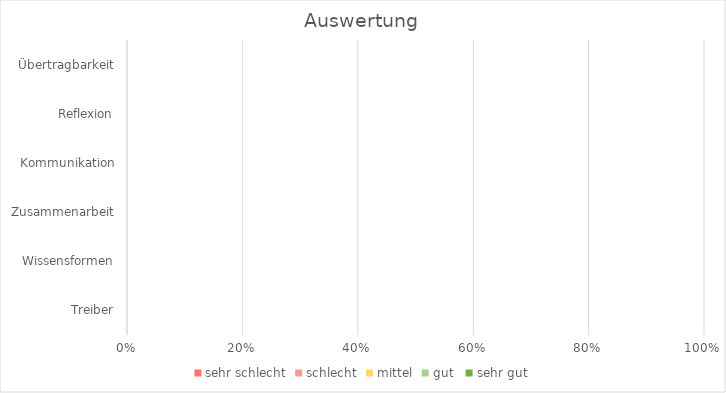
| Category | sehr schlecht | schlecht | mittel | gut  | sehr gut |
|---|---|---|---|---|---|
| Treiber | 0 | 0 | 0 | 0 | 0 |
| Wissensformen | 0 | 0 | 0 | 0 | 0 |
| Zusammenarbeit | 0 | 0 | 0 | 0 | 0 |
| Kommunikation | 0 | 0 | 0 | 0 | 0 |
| Reflexion | 0 | 0 | 0 | 0 | 0 |
| Übertragbarkeit | 0 | 0 | 0 | 0 | 0 |